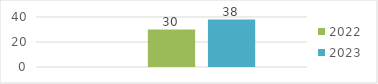
| Category | Abril - Junio | 2022 | 2023 |
|---|---|---|---|
| 0 |  | 30 | 38 |